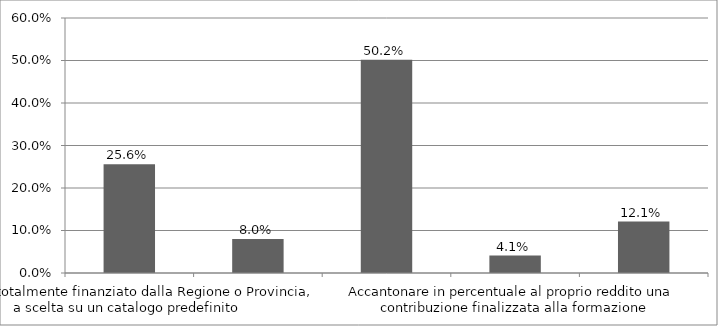
| Category | Series 0 |
|---|---|
| Voucher totalmente finanziato dalla Regione o Provincia, a scelta su un catalogo predefinito | 0.256 |
| Voucher parzialmente finanziato dalla Regione o Provincia,  a libera scelta sul mercato | 0.08 |
| Agevolazioni fiscali | 0.502 |
| Accantonare in percentuale al proprio reddito una contribuzione finalizzata alla formazione | 0.041 |
| Non sa | 0.121 |